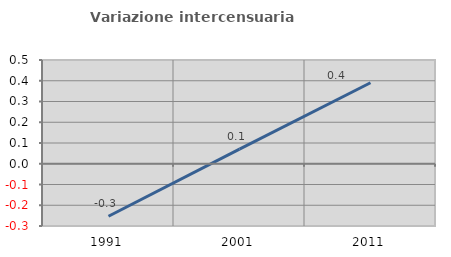
| Category | Variazione intercensuaria annua |
|---|---|
| 1991.0 | -0.253 |
| 2001.0 | 0.071 |
| 2011.0 | 0.39 |